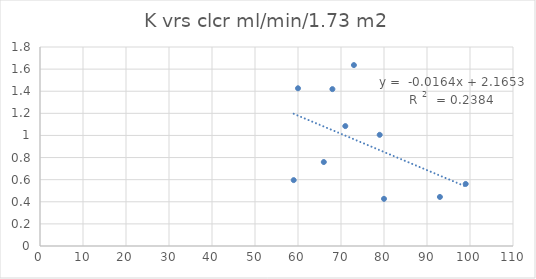
| Category | Series 0 |
|---|---|
| 93.0 | 0.444 |
| 99.0 | 0.561 |
| 60.0 | 1.427 |
| 79.0 | 1.006 |
| 71.0 | 1.085 |
| 73.0 | 1.636 |
| 80.0 | 0.427 |
| 68.0 | 1.419 |
| 59.0 | 0.596 |
| 66.0 | 0.759 |